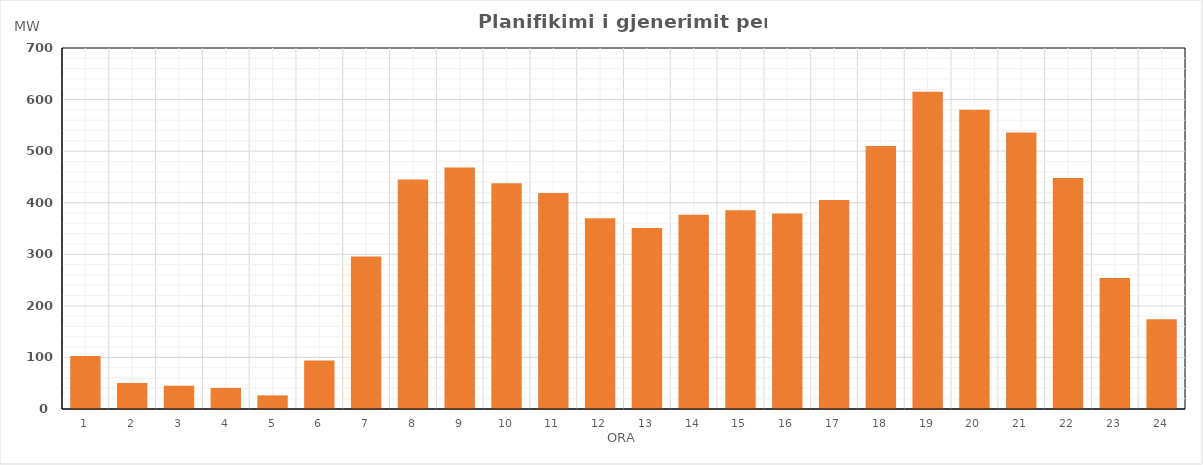
| Category | Max (MW) |
|---|---|
| 0 | 102.897 |
| 1 | 50.447 |
| 2 | 45.111 |
| 3 | 40.971 |
| 4 | 26.362 |
| 5 | 94.185 |
| 6 | 295.524 |
| 7 | 445.063 |
| 8 | 468.3 |
| 9 | 437.507 |
| 10 | 418.948 |
| 11 | 370.103 |
| 12 | 350.963 |
| 13 | 376.789 |
| 14 | 385.593 |
| 15 | 379.071 |
| 16 | 405.329 |
| 17 | 510.185 |
| 18 | 615.24 |
| 19 | 580.135 |
| 20 | 536.232 |
| 21 | 447.975 |
| 22 | 253.853 |
| 23 | 174.253 |